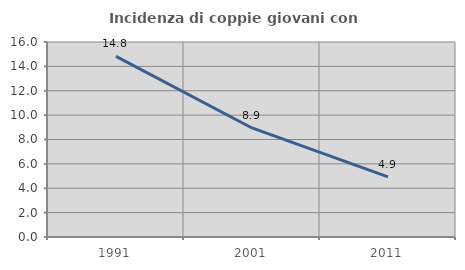
| Category | Incidenza di coppie giovani con figli |
|---|---|
| 1991.0 | 14.824 |
| 2001.0 | 8.947 |
| 2011.0 | 4.928 |